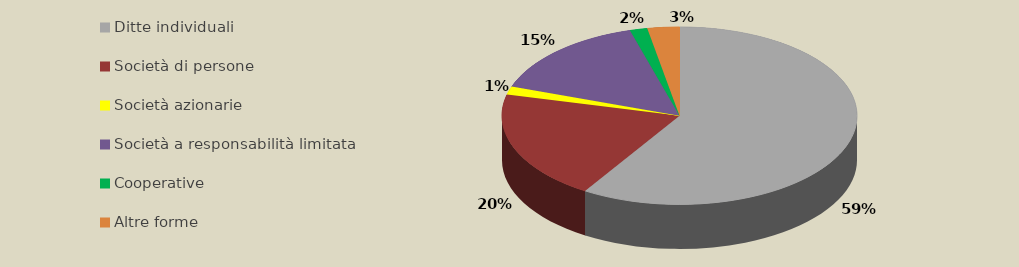
| Category | Series 0 |
|---|---|
| Ditte individuali | 20834 |
| Società di persone | 7050 |
| Società azionarie | 530 |
| Società a responsabilità limitata | 5362 |
| Cooperative | 564 |
| Altre forme | 1027 |